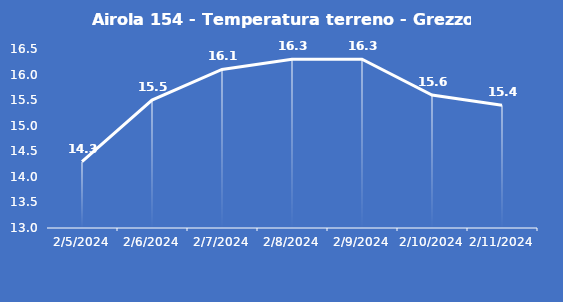
| Category | Airola 154 - Temperatura terreno - Grezzo (°C) |
|---|---|
| 2/5/24 | 14.3 |
| 2/6/24 | 15.5 |
| 2/7/24 | 16.1 |
| 2/8/24 | 16.3 |
| 2/9/24 | 16.3 |
| 2/10/24 | 15.6 |
| 2/11/24 | 15.4 |